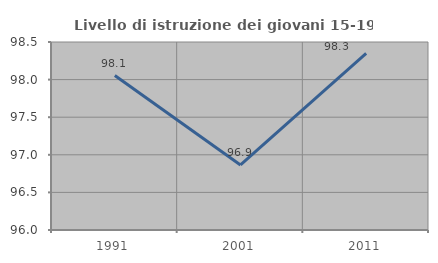
| Category | Livello di istruzione dei giovani 15-19 anni |
|---|---|
| 1991.0 | 98.054 |
| 2001.0 | 96.865 |
| 2011.0 | 98.35 |